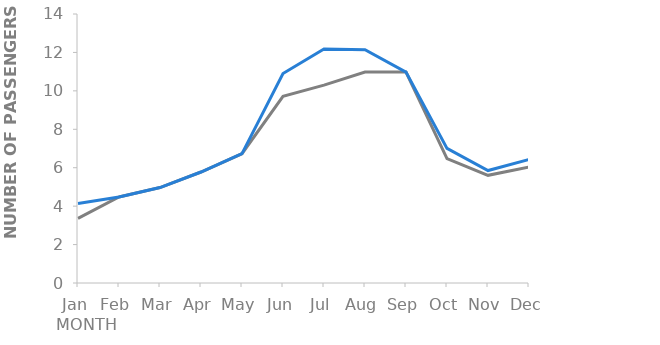
| Category | Family | Max |
|---|---|---|
| Jan | 3361 | 4133 |
| Feb | 4474 | 4474 |
| Mar | 4966 | 4966 |
| Apr | 5777 | 5777 |
| May | 6729 | 6729 |
| Jun | 9717 | 10901 |
| Jul | 10297 | 12182 |
| Aug | 10978 | 12143 |
| Sep | 10977 | 10977 |
| Oct | 6473 | 7006 |
| Nov | 5603 | 5852 |
| Dec | 6038 | 6429 |